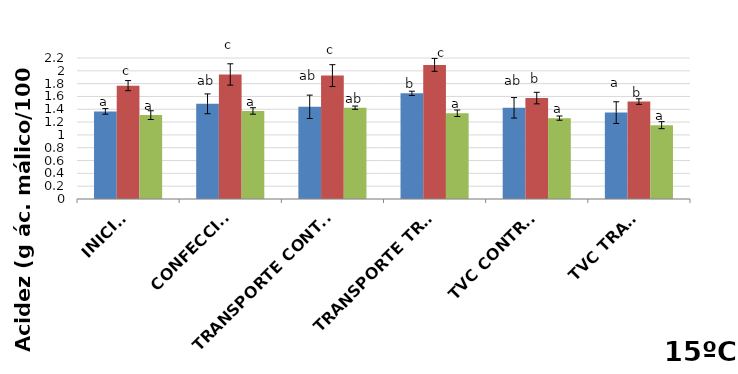
| Category | Black Splendor | Showtime | Black Gold |
|---|---|---|---|
| INICIAL | 1.367 | 1.769 | 1.309 |
| CONFECCIÓN | 1.485 | 1.943 | 1.374 |
| TRANSPORTE CONTROL | 1.438 | 1.925 | 1.425 |
| TRANSPORTE TRAT. | 1.648 | 2.093 | 1.338 |
| TVC CONTROL | 1.423 | 1.575 | 1.262 |
| TVC TRAT. | 1.348 | 1.52 | 1.152 |